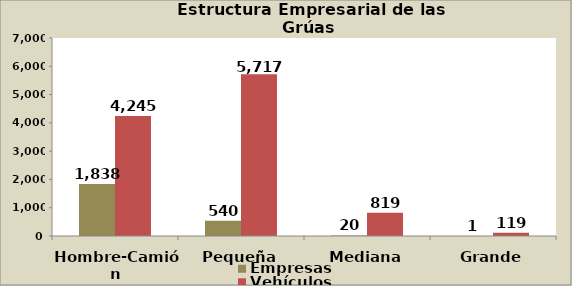
| Category | Empresas | Vehículos |
|---|---|---|
| Hombre-Camión | 1838 | 4245 |
| Pequeña | 540 | 5717 |
| Mediana | 20 | 819 |
| Grande | 1 | 119 |